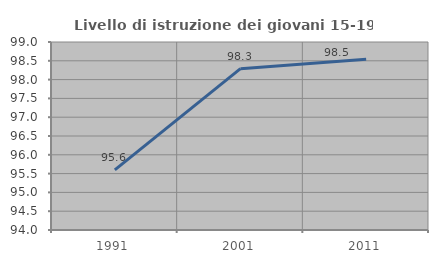
| Category | Livello di istruzione dei giovani 15-19 anni |
|---|---|
| 1991.0 | 95.599 |
| 2001.0 | 98.291 |
| 2011.0 | 98.542 |